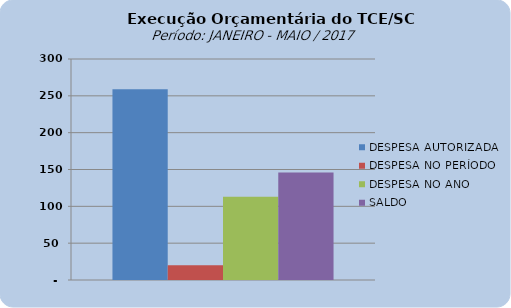
| Category | DESPESA AUTORIZADA | DESPESA NO PERÍODO | DESPESA NO ANO | SALDO |
|---|---|---|---|---|
| 0 | 259048710.69 | 20047656.18 | 113055416.3 | 145993294.39 |